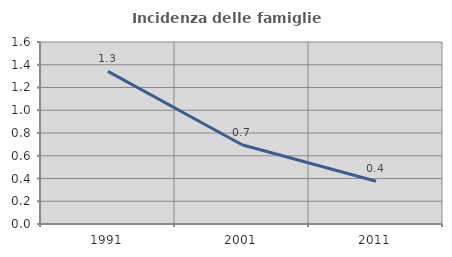
| Category | Incidenza delle famiglie numerose |
|---|---|
| 1991.0 | 1.342 |
| 2001.0 | 0.697 |
| 2011.0 | 0.376 |